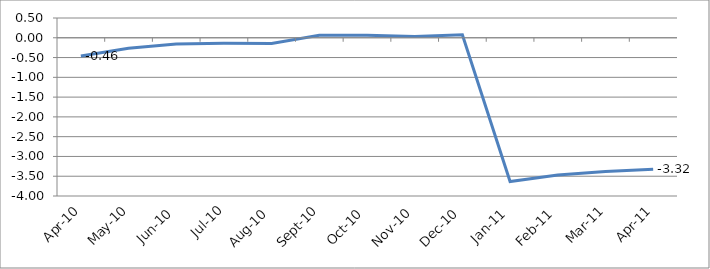
| Category | Series 0 |
|---|---|
| 2010-04-01 | -0.462 |
| 2010-05-01 | -0.262 |
| 2010-06-01 | -0.156 |
| 2010-07-01 | -0.139 |
| 2010-08-01 | -0.145 |
| 2010-09-01 | 0.063 |
| 2010-10-01 | 0.066 |
| 2010-11-01 | 0.034 |
| 2010-12-01 | 0.074 |
| 2011-01-01 | -3.634 |
| 2011-02-01 | -3.469 |
| 2011-03-01 | -3.378 |
| 2011-04-01 | -3.322 |